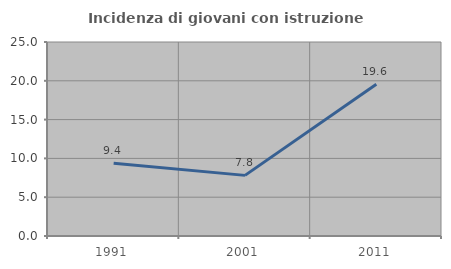
| Category | Incidenza di giovani con istruzione universitaria |
|---|---|
| 1991.0 | 9.375 |
| 2001.0 | 7.812 |
| 2011.0 | 19.565 |